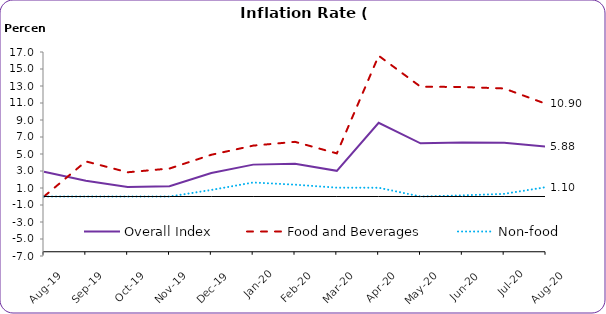
| Category | Overall Index | Food and Beverages | Non-food | Series 3 |
|---|---|---|---|---|
| 2019-08-21 | 2.92 | 0 | 0 |  |
| 2019-09-21 | 1.85 | 4.13 | 0 |  |
| 2019-10-21 | 1.12 | 2.85 | 0 |  |
| 2019-11-21 | 1.22 | 3.29 | 0 |  |
| 2019-12-21 | 2.77 | 4.91 | 0.77 |  |
| 2020-01-21 | 3.75 | 5.985 | 1.65 |  |
| 2020-02-21 | 3.84 | 6.43 | 1.39 |  |
| 2020-03-21 | 3.02 | 5.07 | 1.04 |  |
| 2020-04-21 | 8.67 | 16.56 | 1.03 |  |
| 2020-05-21 | 6.26 | 12.92 | 0 |  |
| 2020-06-21 | 6.36 | 12.88 | 0.13 |  |
| 2020-07-21 | 6.33 | 12.71 | 0.31 |  |
| 2020-08-21 | 5.88 | 10.9 | 1.1 |  |